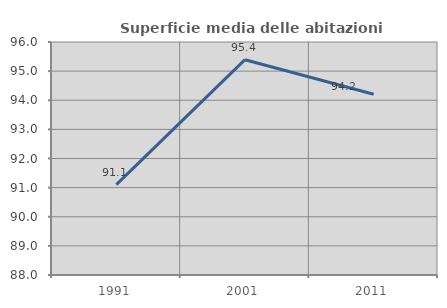
| Category | Superficie media delle abitazioni occupate |
|---|---|
| 1991.0 | 91.104 |
| 2001.0 | 95.393 |
| 2011.0 | 94.205 |